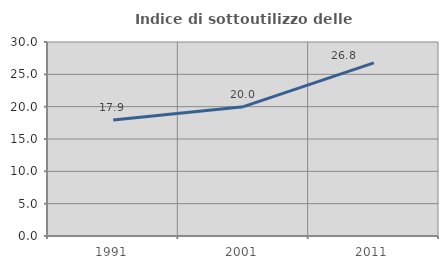
| Category | Indice di sottoutilizzo delle abitazioni  |
|---|---|
| 1991.0 | 17.932 |
| 2001.0 | 20 |
| 2011.0 | 26.765 |